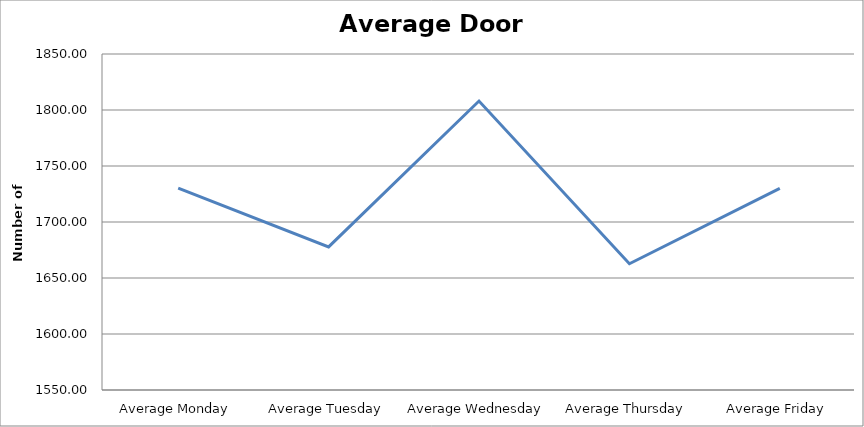
| Category | Series 0 |
|---|---|
| Average Monday | 1730.25 |
| Average Tuesday | 1677.75 |
| Average Wednesday | 1808 |
| Average Thursday | 1662.75 |
| Average Friday | 1730 |